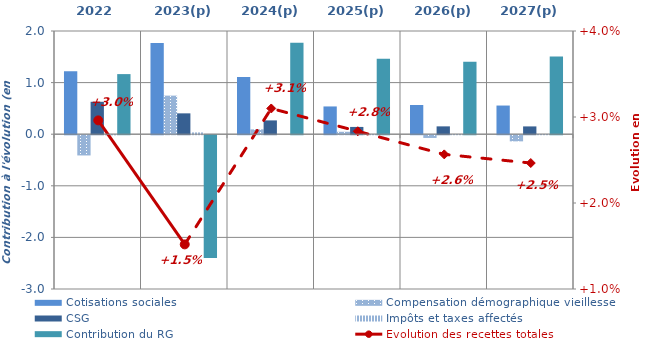
| Category | Cotisations sociales | Compensation démographique vieillesse | CSG | Impôts et taxes affectés | Contribution du RG |
|---|---|---|---|---|---|
| 2022 | 1.219 | -0.393 | 0.628 | -0.003 | 1.165 |
| 2023(p) | 1.769 | 0.748 | 0.404 | 0.034 | -2.379 |
| 2024(p) | 1.109 | 0.094 | 0.267 | 0 | 1.774 |
| 2025(p) | 0.538 | 0.047 | 0.141 | 0.004 | 1.46 |
| 2026(p) | 0.566 | -0.053 | 0.152 | 0.003 | 1.405 |
| 2027(p) | 0.555 | -0.119 | 0.151 | 0.004 | 1.505 |